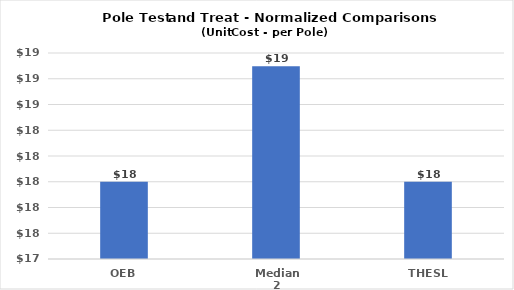
| Category | Series 0 |
|---|---|
| OEB | 18 |
| Median 2 | 18.898 |
| THESL | 18 |